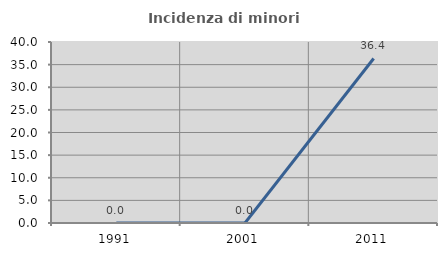
| Category | Incidenza di minori stranieri |
|---|---|
| 1991.0 | 0 |
| 2001.0 | 0 |
| 2011.0 | 36.364 |